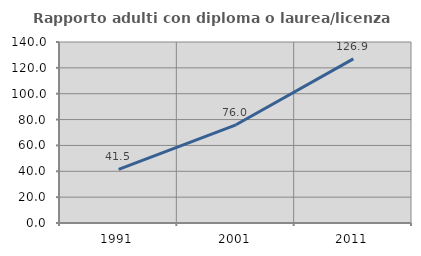
| Category | Rapporto adulti con diploma o laurea/licenza media  |
|---|---|
| 1991.0 | 41.502 |
| 2001.0 | 75.956 |
| 2011.0 | 126.923 |